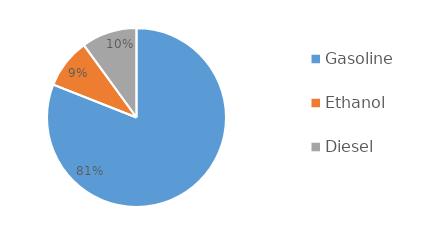
| Category | Series 0 |
|---|---|
| Gasoline | 695426 |
| Ethanol | 77270 |
| Diesel | 85947 |